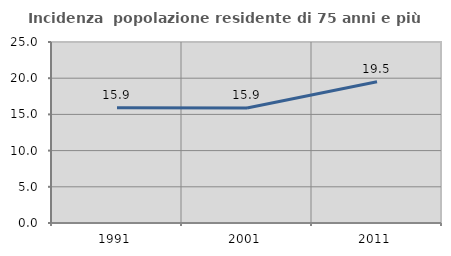
| Category | Incidenza  popolazione residente di 75 anni e più |
|---|---|
| 1991.0 | 15.931 |
| 2001.0 | 15.885 |
| 2011.0 | 19.512 |